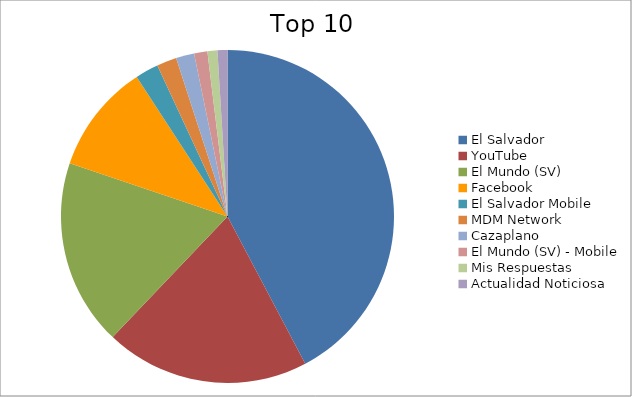
| Category | Series 0 |
|---|---|
| El Salvador | 36.75 |
| YouTube | 17.25 |
| El Mundo (SV) | 15.71 |
| Facebook | 9.26 |
| El Salvador Mobile | 1.96 |
| MDM Network | 1.68 |
| Cazaplano | 1.54 |
| El Mundo (SV) - Mobile | 1.12 |
| Mis Respuestas | 0.84 |
| Actualidad Noticiosa | 0.84 |